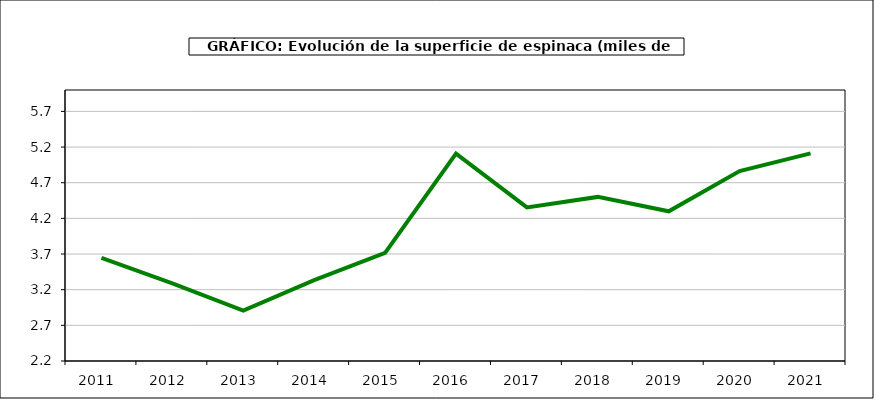
| Category | superficie |
|---|---|
| 2011.0 | 3.647 |
| 2012.0 | 3.289 |
| 2013.0 | 2.908 |
| 2014.0 | 3.335 |
| 2015.0 | 3.717 |
| 2016.0 | 5.108 |
| 2017.0 | 4.353 |
| 2018.0 | 4.501 |
| 2019.0 | 4.299 |
| 2020.0 | 4.864 |
| 2021.0 | 5.112 |